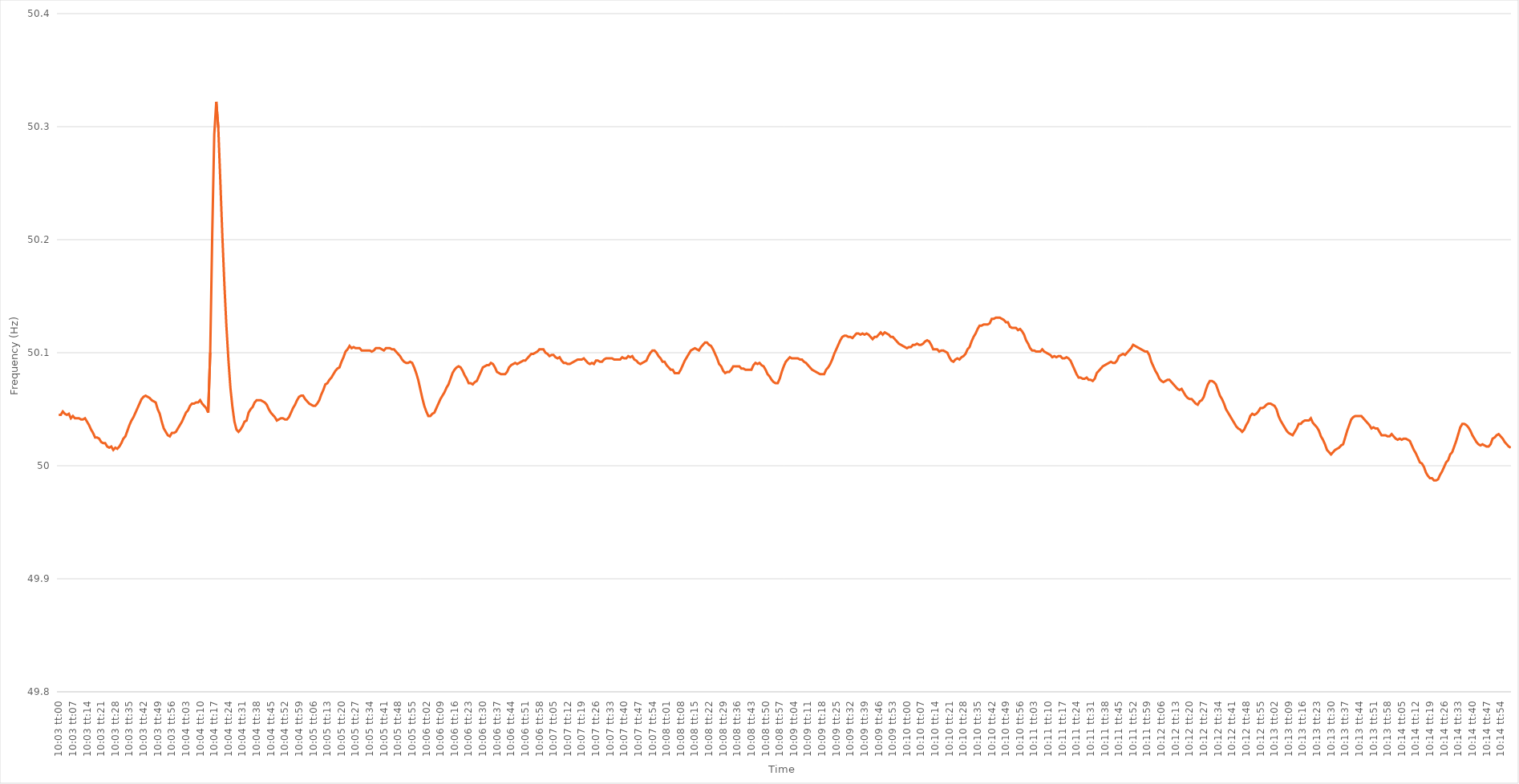
| Category | Series 0 |
|---|---|
| 0.41875 | 50.045 |
| 0.41876157407407405 | 50.045 |
| 0.4187731481481482 | 50.048 |
| 0.41878472222222224 | 50.046 |
| 0.41879629629629633 | 50.045 |
| 0.41880787037037037 | 50.046 |
| 0.4188194444444444 | 50.042 |
| 0.4188310185185185 | 50.044 |
| 0.41884259259259254 | 50.042 |
| 0.4188541666666667 | 50.042 |
| 0.41886574074074073 | 50.042 |
| 0.4188773148148148 | 50.041 |
| 0.41888888888888887 | 50.041 |
| 0.41890046296296296 | 50.042 |
| 0.418912037037037 | 50.039 |
| 0.41892361111111115 | 50.036 |
| 0.4189351851851852 | 50.032 |
| 0.4189467592592593 | 50.029 |
| 0.4189583333333333 | 50.025 |
| 0.4189699074074074 | 50.025 |
| 0.41898148148148145 | 50.024 |
| 0.4189930555555556 | 50.021 |
| 0.41900462962962964 | 50.02 |
| 0.41901620370370374 | 50.02 |
| 0.4190277777777778 | 50.017 |
| 0.4190393518518518 | 50.016 |
| 0.4190509259259259 | 50.017 |
| 0.41906249999999995 | 50.014 |
| 0.4190740740740741 | 50.016 |
| 0.41908564814814814 | 50.015 |
| 0.41909722222222223 | 50.017 |
| 0.41910879629629627 | 50.02 |
| 0.41912037037037037 | 50.024 |
| 0.4191319444444444 | 50.026 |
| 0.41914351851851855 | 50.031 |
| 0.4191550925925926 | 50.036 |
| 0.4191666666666667 | 50.04 |
| 0.4191782407407407 | 50.043 |
| 0.4191898148148148 | 50.047 |
| 0.41920138888888886 | 50.051 |
| 0.419212962962963 | 50.055 |
| 0.41922453703703705 | 50.059 |
| 0.41923611111111114 | 50.061 |
| 0.4192476851851852 | 50.062 |
| 0.4192592592592593 | 50.061 |
| 0.4192708333333333 | 50.06 |
| 0.41928240740740735 | 50.058 |
| 0.4192939814814815 | 50.057 |
| 0.41930555555555554 | 50.056 |
| 0.41931712962962964 | 50.05 |
| 0.4193287037037037 | 50.046 |
| 0.41934027777777777 | 50.039 |
| 0.4193518518518518 | 50.033 |
| 0.41936342592592596 | 50.03 |
| 0.419375 | 50.027 |
| 0.4193865740740741 | 50.026 |
| 0.41939814814814813 | 50.029 |
| 0.4194097222222222 | 50.029 |
| 0.41942129629629626 | 50.03 |
| 0.4194328703703704 | 50.033 |
| 0.41944444444444445 | 50.036 |
| 0.41945601851851855 | 50.039 |
| 0.4194675925925926 | 50.043 |
| 0.4194791666666667 | 50.047 |
| 0.4194907407407407 | 50.049 |
| 0.41950231481481487 | 50.053 |
| 0.4195138888888889 | 50.055 |
| 0.41952546296296295 | 50.055 |
| 0.41953703703703704 | 50.056 |
| 0.4195486111111111 | 50.056 |
| 0.4195601851851852 | 50.058 |
| 0.4195717592592592 | 50.055 |
| 0.41958333333333336 | 50.053 |
| 0.4195949074074074 | 50.051 |
| 0.4196064814814815 | 50.047 |
| 0.41961805555555554 | 50.1 |
| 0.41962962962962963 | 50.205 |
| 0.41964120370370367 | 50.293 |
| 0.4196527777777778 | 50.322 |
| 0.41966435185185186 | 50.299 |
| 0.41967592592592595 | 50.252 |
| 0.4196875 | 50.204 |
| 0.4196990740740741 | 50.161 |
| 0.4197106481481481 | 50.124 |
| 0.4197222222222223 | 50.094 |
| 0.4197337962962963 | 50.069 |
| 0.41974537037037035 | 50.052 |
| 0.41975694444444445 | 50.039 |
| 0.4197685185185185 | 50.032 |
| 0.4197800925925926 | 50.03 |
| 0.4197916666666666 | 50.032 |
| 0.41980324074074077 | 50.035 |
| 0.4198148148148148 | 50.039 |
| 0.4198263888888889 | 50.04 |
| 0.41983796296296294 | 50.047 |
| 0.41984953703703703 | 50.05 |
| 0.4198611111111111 | 50.052 |
| 0.4198726851851852 | 50.056 |
| 0.41988425925925926 | 50.058 |
| 0.41989583333333336 | 50.058 |
| 0.4199074074074074 | 50.058 |
| 0.4199189814814815 | 50.057 |
| 0.41993055555555553 | 50.056 |
| 0.4199421296296297 | 50.054 |
| 0.4199537037037037 | 50.05 |
| 0.4199652777777778 | 50.047 |
| 0.41997685185185185 | 50.045 |
| 0.4199884259259259 | 50.043 |
| 0.42 | 50.04 |
| 0.420011574074074 | 50.041 |
| 0.4200231481481482 | 50.042 |
| 0.4200347222222222 | 50.042 |
| 0.4200462962962963 | 50.041 |
| 0.42005787037037035 | 50.041 |
| 0.42006944444444444 | 50.043 |
| 0.4200810185185185 | 50.047 |
| 0.42009259259259263 | 50.051 |
| 0.42010416666666667 | 50.054 |
| 0.42011574074074076 | 50.058 |
| 0.4201273148148148 | 50.061 |
| 0.4201388888888889 | 50.062 |
| 0.42015046296296293 | 50.062 |
| 0.4201620370370371 | 50.059 |
| 0.4201736111111111 | 50.057 |
| 0.4201851851851852 | 50.055 |
| 0.42019675925925926 | 50.054 |
| 0.42020833333333335 | 50.053 |
| 0.4202199074074074 | 50.053 |
| 0.42023148148148143 | 50.055 |
| 0.4202430555555556 | 50.058 |
| 0.4202546296296296 | 50.063 |
| 0.4202662037037037 | 50.067 |
| 0.42027777777777775 | 50.072 |
| 0.42028935185185184 | 50.073 |
| 0.4203009259259259 | 50.076 |
| 0.42031250000000003 | 50.078 |
| 0.42032407407407407 | 50.081 |
| 0.42033564814814817 | 50.084 |
| 0.4203472222222222 | 50.086 |
| 0.4203587962962963 | 50.087 |
| 0.42037037037037034 | 50.092 |
| 0.4203819444444445 | 50.096 |
| 0.4203935185185185 | 50.101 |
| 0.4204050925925926 | 50.103 |
| 0.42041666666666666 | 50.106 |
| 0.42042824074074076 | 50.104 |
| 0.4204398148148148 | 50.105 |
| 0.42045138888888894 | 50.104 |
| 0.420462962962963 | 50.104 |
| 0.420474537037037 | 50.104 |
| 0.4204861111111111 | 50.102 |
| 0.42049768518518515 | 50.102 |
| 0.42050925925925925 | 50.102 |
| 0.4205208333333333 | 50.102 |
| 0.42053240740740744 | 50.102 |
| 0.4205439814814815 | 50.101 |
| 0.42055555555555557 | 50.102 |
| 0.4205671296296296 | 50.104 |
| 0.4205787037037037 | 50.104 |
| 0.42059027777777774 | 50.104 |
| 0.4206018518518519 | 50.103 |
| 0.42061342592592593 | 50.102 |
| 0.420625 | 50.104 |
| 0.42063657407407407 | 50.104 |
| 0.42064814814814816 | 50.104 |
| 0.4206597222222222 | 50.103 |
| 0.42067129629629635 | 50.103 |
| 0.4206828703703704 | 50.101 |
| 0.4206944444444444 | 50.099 |
| 0.4207060185185185 | 50.097 |
| 0.42071759259259256 | 50.094 |
| 0.42072916666666665 | 50.092 |
| 0.4207407407407407 | 50.091 |
| 0.42075231481481484 | 50.091 |
| 0.4207638888888889 | 50.092 |
| 0.420775462962963 | 50.091 |
| 0.420787037037037 | 50.087 |
| 0.4207986111111111 | 50.082 |
| 0.42081018518518515 | 50.076 |
| 0.4208217592592593 | 50.068 |
| 0.42083333333333334 | 50.06 |
| 0.42084490740740743 | 50.053 |
| 0.42085648148148147 | 50.048 |
| 0.42086805555555556 | 50.044 |
| 0.4208796296296296 | 50.044 |
| 0.42089120370370375 | 50.046 |
| 0.4209027777777778 | 50.047 |
| 0.4209143518518519 | 50.051 |
| 0.4209259259259259 | 50.055 |
| 0.42093749999999996 | 50.059 |
| 0.42094907407407406 | 50.062 |
| 0.4209606481481481 | 50.065 |
| 0.42097222222222225 | 50.069 |
| 0.4209837962962963 | 50.072 |
| 0.4209953703703704 | 50.077 |
| 0.4210069444444444 | 50.082 |
| 0.4210185185185185 | 50.085 |
| 0.42103009259259255 | 50.087 |
| 0.4210416666666667 | 50.088 |
| 0.42105324074074074 | 50.087 |
| 0.42106481481481484 | 50.084 |
| 0.4210763888888889 | 50.08 |
| 0.42108796296296297 | 50.077 |
| 0.421099537037037 | 50.073 |
| 0.42111111111111116 | 50.073 |
| 0.4211226851851852 | 50.072 |
| 0.4211342592592593 | 50.074 |
| 0.42114583333333333 | 50.075 |
| 0.4211574074074074 | 50.079 |
| 0.42116898148148146 | 50.083 |
| 0.4211805555555555 | 50.087 |
| 0.42119212962962965 | 50.088 |
| 0.4212037037037037 | 50.089 |
| 0.4212152777777778 | 50.089 |
| 0.4212268518518518 | 50.091 |
| 0.4212384259259259 | 50.09 |
| 0.42124999999999996 | 50.087 |
| 0.4212615740740741 | 50.083 |
| 0.42127314814814815 | 50.082 |
| 0.42128472222222224 | 50.081 |
| 0.4212962962962963 | 50.081 |
| 0.4213078703703704 | 50.081 |
| 0.4213194444444444 | 50.083 |
| 0.42133101851851856 | 50.087 |
| 0.4213425925925926 | 50.089 |
| 0.4213541666666667 | 50.09 |
| 0.42136574074074074 | 50.091 |
| 0.42137731481481483 | 50.09 |
| 0.42138888888888887 | 50.091 |
| 0.421400462962963 | 50.092 |
| 0.42141203703703706 | 50.093 |
| 0.4214236111111111 | 50.093 |
| 0.4214351851851852 | 50.095 |
| 0.42144675925925923 | 50.097 |
| 0.4214583333333333 | 50.099 |
| 0.42146990740740736 | 50.099 |
| 0.4214814814814815 | 50.1 |
| 0.42149305555555555 | 50.101 |
| 0.42150462962962965 | 50.103 |
| 0.4215162037037037 | 50.103 |
| 0.4215277777777778 | 50.103 |
| 0.4215393518518518 | 50.1 |
| 0.42155092592592597 | 50.099 |
| 0.4215625 | 50.097 |
| 0.4215740740740741 | 50.098 |
| 0.42158564814814814 | 50.098 |
| 0.42159722222222223 | 50.096 |
| 0.4216087962962963 | 50.095 |
| 0.4216203703703704 | 50.096 |
| 0.42163194444444446 | 50.093 |
| 0.4216435185185185 | 50.091 |
| 0.4216550925925926 | 50.091 |
| 0.42166666666666663 | 50.09 |
| 0.42167824074074073 | 50.09 |
| 0.42168981481481477 | 50.091 |
| 0.4217013888888889 | 50.092 |
| 0.42171296296296296 | 50.093 |
| 0.42172453703703705 | 50.094 |
| 0.4217361111111111 | 50.094 |
| 0.4217476851851852 | 50.094 |
| 0.4217592592592592 | 50.095 |
| 0.4217708333333334 | 50.093 |
| 0.4217824074074074 | 50.091 |
| 0.4217939814814815 | 50.09 |
| 0.42180555555555554 | 50.091 |
| 0.42181712962962964 | 50.09 |
| 0.4218287037037037 | 50.093 |
| 0.42184027777777783 | 50.093 |
| 0.42185185185185187 | 50.092 |
| 0.42186342592592596 | 50.092 |
| 0.421875 | 50.094 |
| 0.42188657407407404 | 50.095 |
| 0.42189814814814813 | 50.095 |
| 0.42190972222222217 | 50.095 |
| 0.4219212962962963 | 50.095 |
| 0.42193287037037036 | 50.094 |
| 0.42194444444444446 | 50.094 |
| 0.4219560185185185 | 50.094 |
| 0.4219675925925926 | 50.094 |
| 0.4219791666666666 | 50.096 |
| 0.4219907407407408 | 50.095 |
| 0.4220023148148148 | 50.095 |
| 0.4220138888888889 | 50.097 |
| 0.42202546296296295 | 50.096 |
| 0.42203703703703704 | 50.097 |
| 0.4220486111111111 | 50.094 |
| 0.42206018518518523 | 50.093 |
| 0.42207175925925927 | 50.091 |
| 0.42208333333333337 | 50.09 |
| 0.4220949074074074 | 50.091 |
| 0.4221064814814815 | 50.092 |
| 0.42211805555555554 | 50.093 |
| 0.4221296296296296 | 50.097 |
| 0.4221412037037037 | 50.1 |
| 0.42215277777777777 | 50.102 |
| 0.42216435185185186 | 50.102 |
| 0.4221759259259259 | 50.1 |
| 0.4221875 | 50.097 |
| 0.42219907407407403 | 50.095 |
| 0.4222106481481482 | 50.092 |
| 0.4222222222222222 | 50.092 |
| 0.4222337962962963 | 50.089 |
| 0.42224537037037035 | 50.087 |
| 0.42225694444444445 | 50.085 |
| 0.4222685185185185 | 50.085 |
| 0.42228009259259264 | 50.082 |
| 0.4222916666666667 | 50.082 |
| 0.42230324074074077 | 50.082 |
| 0.4223148148148148 | 50.085 |
| 0.4223263888888889 | 50.089 |
| 0.42233796296296294 | 50.093 |
| 0.422349537037037 | 50.096 |
| 0.42236111111111113 | 50.099 |
| 0.42237268518518517 | 50.102 |
| 0.42238425925925926 | 50.103 |
| 0.4223958333333333 | 50.104 |
| 0.4224074074074074 | 50.103 |
| 0.42241898148148144 | 50.102 |
| 0.4224305555555556 | 50.105 |
| 0.4224421296296296 | 50.107 |
| 0.4224537037037037 | 50.109 |
| 0.42246527777777776 | 50.109 |
| 0.42247685185185185 | 50.107 |
| 0.4224884259259259 | 50.106 |
| 0.42250000000000004 | 50.103 |
| 0.4225115740740741 | 50.099 |
| 0.4225231481481482 | 50.095 |
| 0.4225347222222222 | 50.09 |
| 0.4225462962962963 | 50.088 |
| 0.42255787037037035 | 50.084 |
| 0.4225694444444445 | 50.082 |
| 0.42258101851851854 | 50.083 |
| 0.4225925925925926 | 50.083 |
| 0.42260416666666667 | 50.085 |
| 0.4226157407407407 | 50.088 |
| 0.4226273148148148 | 50.088 |
| 0.42263888888888884 | 50.088 |
| 0.422650462962963 | 50.088 |
| 0.42266203703703703 | 50.086 |
| 0.4226736111111111 | 50.086 |
| 0.42268518518518516 | 50.085 |
| 0.42269675925925926 | 50.085 |
| 0.4227083333333333 | 50.085 |
| 0.42271990740740745 | 50.085 |
| 0.4227314814814815 | 50.089 |
| 0.4227430555555556 | 50.091 |
| 0.4227546296296296 | 50.09 |
| 0.4227662037037037 | 50.091 |
| 0.42277777777777775 | 50.089 |
| 0.4227893518518519 | 50.088 |
| 0.42280092592592594 | 50.085 |
| 0.42281250000000004 | 50.081 |
| 0.4228240740740741 | 50.079 |
| 0.4228356481481481 | 50.076 |
| 0.4228472222222222 | 50.074 |
| 0.42285879629629625 | 50.073 |
| 0.4228703703703704 | 50.073 |
| 0.42288194444444444 | 50.077 |
| 0.42289351851851853 | 50.083 |
| 0.42290509259259257 | 50.088 |
| 0.42291666666666666 | 50.092 |
| 0.4229282407407407 | 50.094 |
| 0.42293981481481485 | 50.096 |
| 0.4229513888888889 | 50.095 |
| 0.422962962962963 | 50.095 |
| 0.422974537037037 | 50.095 |
| 0.4229861111111111 | 50.095 |
| 0.42299768518518516 | 50.094 |
| 0.4230092592592593 | 50.094 |
| 0.42302083333333335 | 50.092 |
| 0.42303240740740744 | 50.091 |
| 0.4230439814814815 | 50.089 |
| 0.4230555555555555 | 50.087 |
| 0.4230671296296296 | 50.085 |
| 0.42307870370370365 | 50.084 |
| 0.4230902777777778 | 50.083 |
| 0.42310185185185184 | 50.082 |
| 0.42311342592592593 | 50.081 |
| 0.423125 | 50.081 |
| 0.42313657407407407 | 50.081 |
| 0.4231481481481481 | 50.085 |
| 0.42315972222222226 | 50.087 |
| 0.4231712962962963 | 50.09 |
| 0.4231828703703704 | 50.094 |
| 0.42319444444444443 | 50.099 |
| 0.4232060185185185 | 50.103 |
| 0.42321759259259256 | 50.107 |
| 0.4232291666666667 | 50.111 |
| 0.42324074074074075 | 50.114 |
| 0.42325231481481485 | 50.115 |
| 0.4232638888888889 | 50.115 |
| 0.423275462962963 | 50.114 |
| 0.423287037037037 | 50.114 |
| 0.42329861111111117 | 50.113 |
| 0.4233101851851852 | 50.115 |
| 0.42332175925925924 | 50.117 |
| 0.42333333333333334 | 50.117 |
| 0.4233449074074074 | 50.116 |
| 0.4233564814814815 | 50.117 |
| 0.4233680555555555 | 50.116 |
| 0.42337962962962966 | 50.117 |
| 0.4233912037037037 | 50.116 |
| 0.4234027777777778 | 50.114 |
| 0.42341435185185183 | 50.112 |
| 0.42342592592592593 | 50.114 |
| 0.42343749999999997 | 50.114 |
| 0.4234490740740741 | 50.116 |
| 0.42346064814814816 | 50.118 |
| 0.42347222222222225 | 50.116 |
| 0.4234837962962963 | 50.118 |
| 0.4234953703703704 | 50.117 |
| 0.4235069444444444 | 50.116 |
| 0.42351851851851857 | 50.114 |
| 0.4235300925925926 | 50.114 |
| 0.42354166666666665 | 50.112 |
| 0.42355324074074074 | 50.11 |
| 0.4235648148148148 | 50.108 |
| 0.4235763888888889 | 50.107 |
| 0.4235879629629629 | 50.106 |
| 0.42359953703703707 | 50.105 |
| 0.4236111111111111 | 50.104 |
| 0.4236226851851852 | 50.105 |
| 0.42363425925925924 | 50.105 |
| 0.42364583333333333 | 50.107 |
| 0.42365740740740737 | 50.107 |
| 0.4236689814814815 | 50.108 |
| 0.42368055555555556 | 50.107 |
| 0.42369212962962965 | 50.107 |
| 0.4237037037037037 | 50.108 |
| 0.4237152777777778 | 50.11 |
| 0.4237268518518518 | 50.111 |
| 0.423738425925926 | 50.11 |
| 0.42375 | 50.107 |
| 0.4237615740740741 | 50.103 |
| 0.42377314814814815 | 50.103 |
| 0.4237847222222222 | 50.103 |
| 0.4237962962962963 | 50.101 |
| 0.4238078703703703 | 50.102 |
| 0.42381944444444447 | 50.102 |
| 0.4238310185185185 | 50.101 |
| 0.4238425925925926 | 50.1 |
| 0.42385416666666664 | 50.096 |
| 0.42386574074074074 | 50.093 |
| 0.4238773148148148 | 50.092 |
| 0.4238888888888889 | 50.094 |
| 0.42390046296296297 | 50.095 |
| 0.42391203703703706 | 50.094 |
| 0.4239236111111111 | 50.096 |
| 0.4239351851851852 | 50.097 |
| 0.42394675925925923 | 50.099 |
| 0.4239583333333334 | 50.103 |
| 0.4239699074074074 | 50.105 |
| 0.4239814814814815 | 50.11 |
| 0.42399305555555555 | 50.114 |
| 0.42400462962962965 | 50.117 |
| 0.4240162037037037 | 50.121 |
| 0.4240277777777777 | 50.124 |
| 0.4240393518518519 | 50.124 |
| 0.4240509259259259 | 50.125 |
| 0.4240625 | 50.125 |
| 0.42407407407407405 | 50.125 |
| 0.42408564814814814 | 50.126 |
| 0.4240972222222222 | 50.13 |
| 0.42410879629629633 | 50.13 |
| 0.42412037037037037 | 50.131 |
| 0.42413194444444446 | 50.131 |
| 0.4241435185185185 | 50.131 |
| 0.4241550925925926 | 50.13 |
| 0.42416666666666664 | 50.129 |
| 0.4241782407407408 | 50.127 |
| 0.4241898148148148 | 50.127 |
| 0.4242013888888889 | 50.123 |
| 0.42421296296296296 | 50.122 |
| 0.42422453703703705 | 50.122 |
| 0.4242361111111111 | 50.122 |
| 0.42424768518518513 | 50.12 |
| 0.4242592592592593 | 50.121 |
| 0.4242708333333333 | 50.119 |
| 0.4242824074074074 | 50.116 |
| 0.42429398148148145 | 50.111 |
| 0.42430555555555555 | 50.108 |
| 0.4243171296296296 | 50.104 |
| 0.42432870370370374 | 50.102 |
| 0.4243402777777778 | 50.102 |
| 0.42435185185185187 | 50.101 |
| 0.4243634259259259 | 50.101 |
| 0.424375 | 50.101 |
| 0.42438657407407404 | 50.103 |
| 0.4243981481481482 | 50.101 |
| 0.42440972222222223 | 50.1 |
| 0.4244212962962963 | 50.099 |
| 0.42443287037037036 | 50.098 |
| 0.42444444444444446 | 50.096 |
| 0.4244560185185185 | 50.097 |
| 0.42446759259259265 | 50.096 |
| 0.4244791666666667 | 50.097 |
| 0.4244907407407407 | 50.097 |
| 0.4245023148148148 | 50.095 |
| 0.42451388888888886 | 50.095 |
| 0.42452546296296295 | 50.096 |
| 0.424537037037037 | 50.095 |
| 0.42454861111111114 | 50.093 |
| 0.4245601851851852 | 50.089 |
| 0.4245717592592593 | 50.085 |
| 0.4245833333333333 | 50.081 |
| 0.4245949074074074 | 50.078 |
| 0.42460648148148145 | 50.078 |
| 0.4246180555555556 | 50.077 |
| 0.42462962962962963 | 50.077 |
| 0.42464120370370373 | 50.078 |
| 0.42465277777777777 | 50.076 |
| 0.42466435185185186 | 50.076 |
| 0.4246759259259259 | 50.075 |
| 0.42468750000000005 | 50.077 |
| 0.4246990740740741 | 50.082 |
| 0.4247106481481482 | 50.084 |
| 0.4247222222222222 | 50.086 |
| 0.42473379629629626 | 50.088 |
| 0.42474537037037036 | 50.089 |
| 0.4247569444444444 | 50.09 |
| 0.42476851851851855 | 50.091 |
| 0.4247800925925926 | 50.092 |
| 0.4247916666666667 | 50.091 |
| 0.4248032407407407 | 50.091 |
| 0.4248148148148148 | 50.093 |
| 0.42482638888888885 | 50.097 |
| 0.424837962962963 | 50.098 |
| 0.42484953703703704 | 50.099 |
| 0.42486111111111113 | 50.098 |
| 0.4248726851851852 | 50.1 |
| 0.42488425925925927 | 50.102 |
| 0.4248958333333333 | 50.104 |
| 0.42490740740740746 | 50.107 |
| 0.4249189814814815 | 50.106 |
| 0.4249305555555556 | 50.105 |
| 0.42494212962962963 | 50.104 |
| 0.42495370370370367 | 50.103 |
| 0.42496527777777776 | 50.102 |
| 0.4249768518518518 | 50.101 |
| 0.42498842592592595 | 50.101 |
| 0.425 | 50.098 |
| 0.4250115740740741 | 50.092 |
| 0.4250231481481481 | 50.088 |
| 0.4250347222222222 | 50.084 |
| 0.42504629629629626 | 50.081 |
| 0.4250578703703704 | 50.077 |
| 0.42506944444444444 | 50.075 |
| 0.42508101851851854 | 50.074 |
| 0.4250925925925926 | 50.075 |
| 0.42510416666666667 | 50.076 |
| 0.4251157407407407 | 50.076 |
| 0.42512731481481486 | 50.074 |
| 0.4251388888888889 | 50.072 |
| 0.425150462962963 | 50.07 |
| 0.42516203703703703 | 50.068 |
| 0.4251736111111111 | 50.067 |
| 0.42518518518518517 | 50.068 |
| 0.4251967592592592 | 50.065 |
| 0.42520833333333335 | 50.062 |
| 0.4252199074074074 | 50.06 |
| 0.4252314814814815 | 50.059 |
| 0.4252430555555555 | 50.059 |
| 0.4252546296296296 | 50.057 |
| 0.42526620370370366 | 50.055 |
| 0.4252777777777778 | 50.054 |
| 0.42528935185185185 | 50.057 |
| 0.42530092592592594 | 50.058 |
| 0.4253125 | 50.061 |
| 0.4253240740740741 | 50.067 |
| 0.4253356481481481 | 50.072 |
| 0.42534722222222227 | 50.075 |
| 0.4253587962962963 | 50.075 |
| 0.4253703703703704 | 50.074 |
| 0.42538194444444444 | 50.072 |
| 0.42539351851851853 | 50.067 |
| 0.42540509259259257 | 50.062 |
| 0.4254166666666667 | 50.059 |
| 0.42542824074074076 | 50.055 |
| 0.4254398148148148 | 50.05 |
| 0.4254513888888889 | 50.047 |
| 0.42546296296296293 | 50.044 |
| 0.425474537037037 | 50.041 |
| 0.42548611111111106 | 50.038 |
| 0.4254976851851852 | 50.035 |
| 0.42550925925925925 | 50.033 |
| 0.42552083333333335 | 50.032 |
| 0.4255324074074074 | 50.03 |
| 0.4255439814814815 | 50.032 |
| 0.4255555555555555 | 50.036 |
| 0.42556712962962967 | 50.039 |
| 0.4255787037037037 | 50.044 |
| 0.4255902777777778 | 50.046 |
| 0.42560185185185184 | 50.045 |
| 0.42561342592592594 | 50.046 |
| 0.425625 | 50.048 |
| 0.4256365740740741 | 50.051 |
| 0.42564814814814816 | 50.051 |
| 0.4256597222222222 | 50.052 |
| 0.4256712962962963 | 50.054 |
| 0.42568287037037034 | 50.055 |
| 0.42569444444444443 | 50.055 |
| 0.42570601851851847 | 50.054 |
| 0.4257175925925926 | 50.053 |
| 0.42572916666666666 | 50.05 |
| 0.42574074074074075 | 50.044 |
| 0.4257523148148148 | 50.04 |
| 0.4257638888888889 | 50.037 |
| 0.4257754629629629 | 50.034 |
| 0.4257870370370371 | 50.031 |
| 0.4257986111111111 | 50.029 |
| 0.4258101851851852 | 50.028 |
| 0.42582175925925925 | 50.027 |
| 0.42583333333333334 | 50.03 |
| 0.4258449074074074 | 50.033 |
| 0.42585648148148153 | 50.037 |
| 0.42586805555555557 | 50.037 |
| 0.42587962962962966 | 50.039 |
| 0.4258912037037037 | 50.04 |
| 0.4259027777777778 | 50.04 |
| 0.42591435185185184 | 50.04 |
| 0.4259259259259259 | 50.042 |
| 0.4259375 | 50.038 |
| 0.42594907407407406 | 50.036 |
| 0.42596064814814816 | 50.034 |
| 0.4259722222222222 | 50.031 |
| 0.4259837962962963 | 50.026 |
| 0.42599537037037033 | 50.023 |
| 0.4260069444444445 | 50.019 |
| 0.4260185185185185 | 50.014 |
| 0.4260300925925926 | 50.012 |
| 0.42604166666666665 | 50.01 |
| 0.42605324074074075 | 50.012 |
| 0.4260648148148148 | 50.014 |
| 0.42607638888888894 | 50.015 |
| 0.426087962962963 | 50.016 |
| 0.42609953703703707 | 50.018 |
| 0.4261111111111111 | 50.019 |
| 0.4261226851851852 | 50.025 |
| 0.42613425925925924 | 50.031 |
| 0.4261458333333333 | 50.036 |
| 0.42615740740740743 | 50.041 |
| 0.42616898148148147 | 50.043 |
| 0.42618055555555556 | 50.044 |
| 0.4261921296296296 | 50.044 |
| 0.4262037037037037 | 50.044 |
| 0.42621527777777773 | 50.044 |
| 0.4262268518518519 | 50.042 |
| 0.4262384259259259 | 50.04 |
| 0.42625 | 50.038 |
| 0.42626157407407406 | 50.036 |
| 0.42627314814814815 | 50.033 |
| 0.4262847222222222 | 50.034 |
| 0.42629629629629634 | 50.033 |
| 0.4263078703703704 | 50.033 |
| 0.4263194444444445 | 50.03 |
| 0.4263310185185185 | 50.027 |
| 0.4263425925925926 | 50.027 |
| 0.42635416666666665 | 50.027 |
| 0.4263657407407408 | 50.026 |
| 0.42637731481481483 | 50.026 |
| 0.4263888888888889 | 50.028 |
| 0.42640046296296297 | 50.026 |
| 0.426412037037037 | 50.024 |
| 0.4264236111111111 | 50.023 |
| 0.42643518518518514 | 50.024 |
| 0.4264467592592593 | 50.023 |
| 0.42645833333333333 | 50.024 |
| 0.4264699074074074 | 50.024 |
| 0.42648148148148146 | 50.023 |
| 0.42649305555555556 | 50.022 |
| 0.4265046296296296 | 50.018 |
| 0.42651620370370374 | 50.014 |
| 0.4265277777777778 | 50.011 |
| 0.4265393518518519 | 50.007 |
| 0.4265509259259259 | 50.003 |
| 0.4265625 | 50.002 |
| 0.42657407407407405 | 49.999 |
| 0.4265856481481482 | 49.994 |
| 0.42659722222222224 | 49.991 |
| 0.42660879629629633 | 49.989 |
| 0.42662037037037037 | 49.989 |
| 0.4266319444444444 | 49.987 |
| 0.4266435185185185 | 49.987 |
| 0.42665509259259254 | 49.988 |
| 0.4266666666666667 | 49.992 |
| 0.42667824074074073 | 49.995 |
| 0.4266898148148148 | 49.999 |
| 0.42670138888888887 | 50.003 |
| 0.42671296296296296 | 50.005 |
| 0.426724537037037 | 50.01 |
| 0.42673611111111115 | 50.012 |
| 0.4267476851851852 | 50.017 |
| 0.4267592592592593 | 50.022 |
| 0.4267708333333333 | 50.028 |
| 0.4267824074074074 | 50.034 |
| 0.42679398148148145 | 50.037 |
| 0.4268055555555556 | 50.037 |
| 0.42681712962962964 | 50.036 |
| 0.42682870370370374 | 50.034 |
| 0.4268402777777778 | 50.031 |
| 0.4268518518518518 | 50.027 |
| 0.4268634259259259 | 50.024 |
| 0.42687499999999995 | 50.021 |
| 0.4268865740740741 | 50.019 |
| 0.42689814814814814 | 50.018 |
| 0.42690972222222223 | 50.019 |
| 0.42692129629629627 | 50.018 |
| 0.42693287037037037 | 50.017 |
| 0.4269444444444444 | 50.017 |
| 0.42695601851851855 | 50.019 |
| 0.4269675925925926 | 50.024 |
| 0.4269791666666667 | 50.025 |
| 0.4269907407407407 | 50.027 |
| 0.4270023148148148 | 50.028 |
| 0.42701388888888886 | 50.026 |
| 0.427025462962963 | 50.024 |
| 0.42703703703703705 | 50.021 |
| 0.42704861111111114 | 50.019 |
| 0.4270601851851852 | 50.017 |
| 0.4270717592592593 | 50.016 |